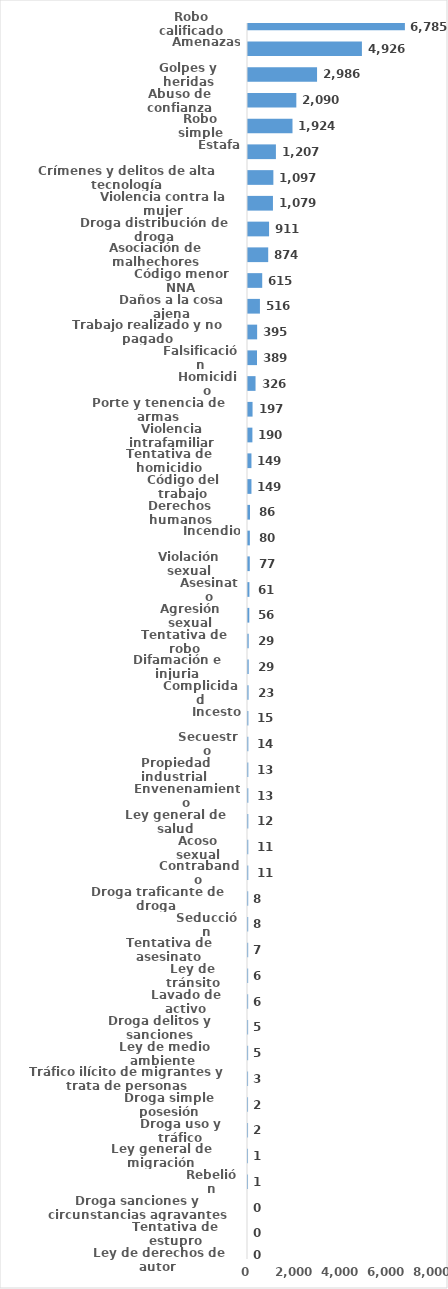
| Category | Series 0 |
|---|---|
| Robo calificado | 6785 |
| Amenazas | 4926 |
| Golpes y heridas | 2986 |
| Abuso de confianza | 2090 |
| Robo simple | 1924 |
| Estafa | 1207 |
| Crímenes y delitos de alta tecnología | 1097 |
| Violencia contra la mujer | 1079 |
| Droga distribución de droga | 911 |
| Asociación de malhechores | 874 |
| Código menor NNA | 615 |
| Daños a la cosa ajena | 516 |
| Trabajo realizado y no pagado | 395 |
| Falsificación | 389 |
| Homicidio | 326 |
| Porte y tenencia de armas | 197 |
| Violencia intrafamiliar | 190 |
| Tentativa de homicidio | 149 |
| Código del trabajo | 149 |
| Derechos humanos | 86 |
| Incendio | 80 |
| Violación sexual | 77 |
| Asesinato | 61 |
| Agresión sexual | 56 |
| Tentativa de robo | 29 |
| Difamación e injuria | 29 |
| Complicidad | 23 |
| Incesto | 15 |
| Secuestro | 14 |
| Propiedad industrial  | 13 |
| Envenenamiento | 13 |
| Ley general de salud | 12 |
| Acoso sexual | 11 |
| Contrabando | 11 |
| Droga traficante de droga  | 8 |
| Seducción | 8 |
| Tentativa de asesinato | 7 |
| Ley de tránsito | 6 |
| Lavado de activo | 6 |
| Droga delitos y sanciones | 5 |
| Ley de medio ambiente  | 5 |
| Tráfico ilícito de migrantes y trata de personas | 3 |
| Droga simple posesión | 2 |
| Droga uso y tráfico | 2 |
| Ley general de migración | 1 |
| Rebelión | 1 |
| Droga sanciones y circunstancias agravantes | 0 |
| Tentativa de estupro | 0 |
| Ley de derechos de autor  | 0 |